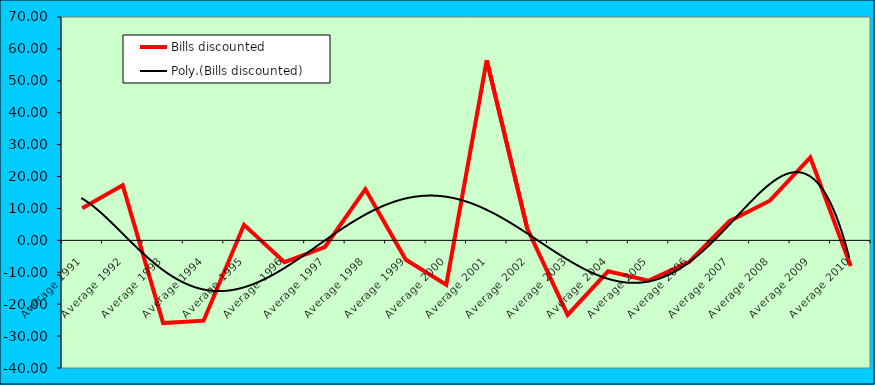
| Category | Bills discounted |
|---|---|
| Average 1991 | 10.042 |
| Average 1992 | 17.295 |
| Average 1993 | -25.925 |
| Average 1994 | -25.172 |
| Average 1995 | 4.88 |
| Average 1996 | -6.836 |
| Average 1997 | -2.085 |
| Average 1998 | 16.055 |
| Average 1999 | -6.067 |
| Average 2000 | -13.896 |
| Average 2001 | 56.494 |
| Average 2002 | 3.8 |
| Average 2003 | -23.373 |
| Average 2004 | -9.691 |
| Average 2005 | -12.635 |
| Average 2006 | -6.814 |
| Average 2007 | 6.033 |
| Average 2008 | 12.426 |
| Average 2009 | 25.971 |
| Average 2010 | -8.078 |